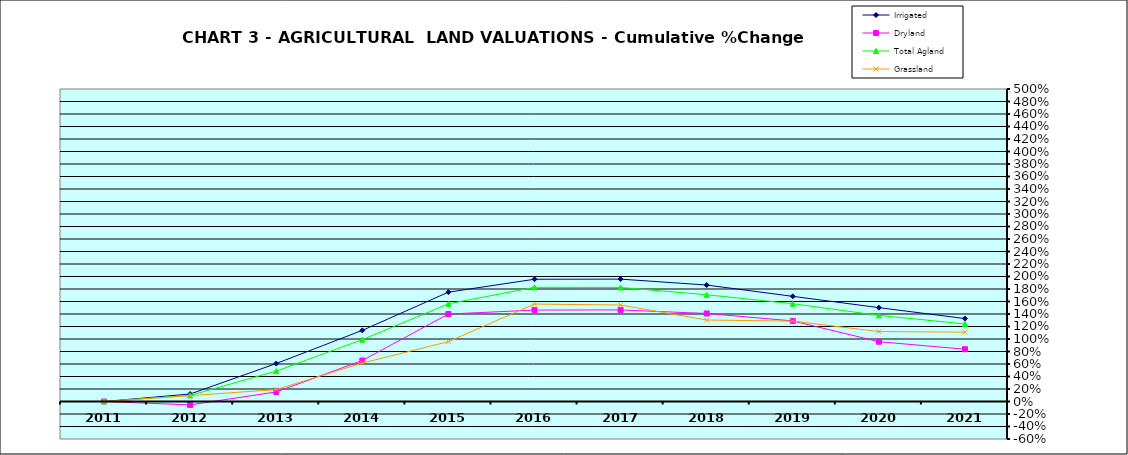
| Category | Irrigated | Dryland | Total Agland | Grassland |
|---|---|---|---|---|
| 2011.0 | 0 | 0 | 0 | 0 |
| 2012.0 | 0.12 | -0.054 | 0.098 | 0.094 |
| 2013.0 | 0.607 | 0.153 | 0.486 | 0.191 |
| 2014.0 | 1.138 | 0.656 | 0.989 | 0.615 |
| 2015.0 | 1.75 | 1.399 | 1.563 | 0.958 |
| 2016.0 | 1.956 | 1.463 | 1.827 | 1.559 |
| 2017.0 | 1.958 | 1.465 | 1.825 | 1.544 |
| 2018.0 | 1.863 | 1.408 | 1.708 | 1.304 |
| 2019.0 | 1.683 | 1.289 | 1.564 | 1.286 |
| 2020.0 | 1.502 | 0.957 | 1.378 | 1.119 |
| 2021.0 | 1.327 | 0.836 | 1.241 | 1.109 |